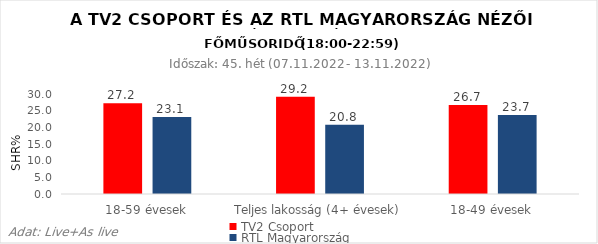
| Category | TV2 Csoport | RTL Magyarország |
|---|---|---|
| 18-59 évesek | 27.2 | 23.1 |
| Teljes lakosság (4+ évesek) | 29.2 | 20.8 |
| 18-49 évesek | 26.7 | 23.7 |